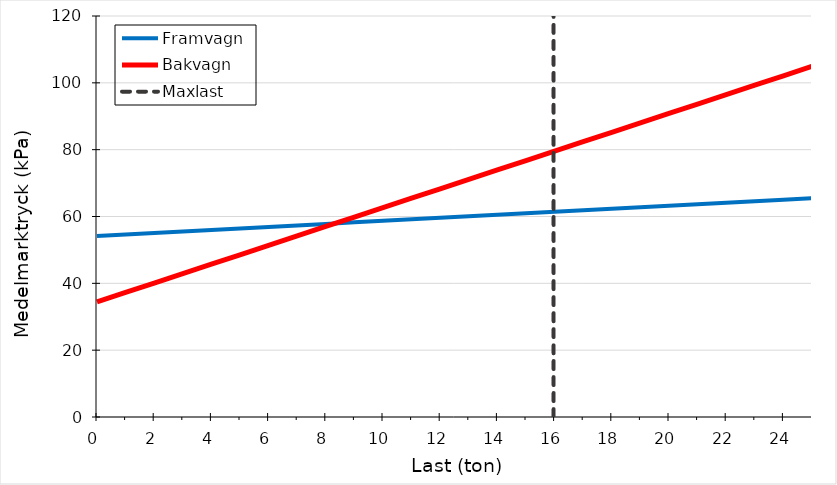
| Category | Framvagn | Bakvagn |
|---|---|---|
| 0.0 | 54.179 | 34.456 |
| 1.0 | 54.631 | 37.275 |
| 2.0 | 55.082 | 40.094 |
| 3.0 | 55.534 | 42.914 |
| 4.0 | 55.985 | 45.733 |
| 5.0 | 56.437 | 48.552 |
| 6.0 | 56.888 | 51.371 |
| 7.0 | 57.34 | 54.19 |
| 8.0 | 57.791 | 57.009 |
| 9.0 | 58.243 | 59.828 |
| 10.0 | 58.694 | 62.648 |
| 11.0 | 59.146 | 65.467 |
| 12.0 | 59.597 | 68.286 |
| 13.0 | 60.049 | 71.105 |
| 14.0 | 60.5 | 73.924 |
| 15.0 | 60.952 | 76.743 |
| 16.0 | 61.403 | 79.562 |
| 17.0 | 61.855 | 82.381 |
| 18.0 | 62.306 | 85.201 |
| 19.0 | 62.758 | 88.02 |
| 20.0 | 63.209 | 90.839 |
| 21.0 | 63.661 | 93.658 |
| 22.0 | 64.112 | 96.477 |
| 23.0 | 64.564 | 99.296 |
| 24.0 | 65.015 | 102.115 |
| 25.0 | 65.467 | 104.935 |